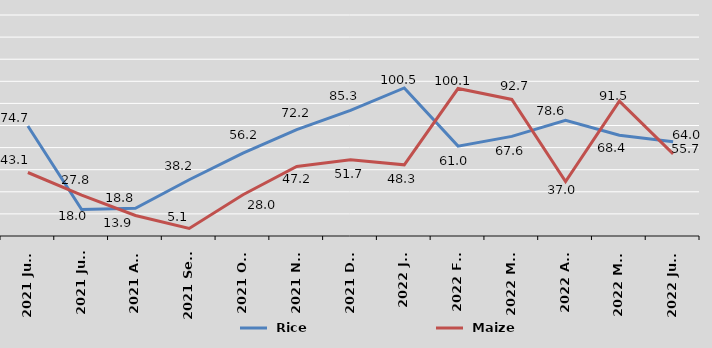
| Category |  Rice  |  Maize |
|---|---|---|
| 2021 June | 74.7 | 43.1 |
| 2021 July | 18 | 27.8 |
| 2021 Aug | 18.8 | 13.9 |
| 2021 Sept | 38.2 | 5.1 |
| 2021 Oct | 56.2 | 28 |
| 2021 Nov | 72.2 | 47.2 |
| 2021 Dec | 85.3 | 51.7 |
| 2022 Jan | 100.5 | 48.3 |
| 2022 Feb | 61 | 100.1 |
| 2022 Mar | 67.6 | 92.7 |
| 2022 Apr | 78.6 | 37 |
| 2022 May | 68.4 | 91.5 |
| 2022 June | 64 | 55.7 |